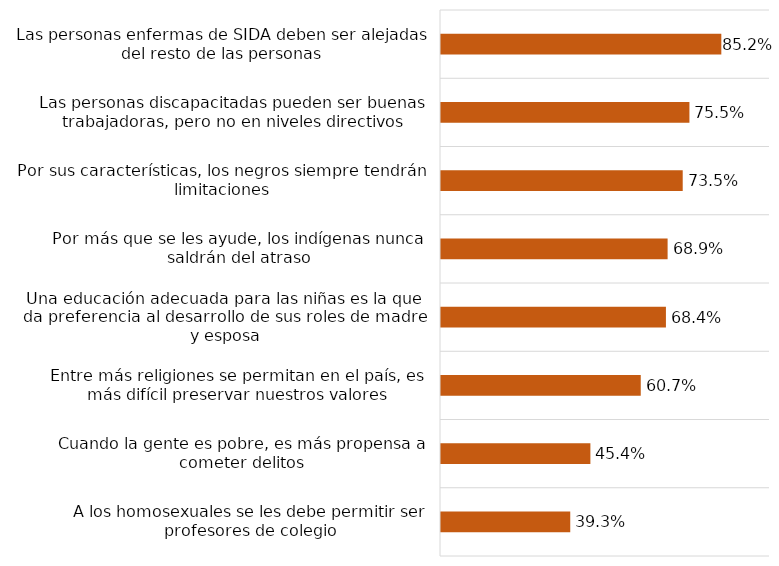
| Category | Series 0 |
|---|---|
| A los homosexuales se les debe permitir ser profesores de colegio | 0.393 |
| Cuando la gente es pobre, es más propensa a cometer delitos | 0.454 |
| Entre más religiones se permitan en el país, es más difícil preservar nuestros valores | 0.607 |
| Una educación adecuada para las niñas es la que da preferencia al desarrollo de sus roles de madre y esposa | 0.684 |
| Por más que se les ayude, los indígenas nunca saldrán del atraso | 0.689 |
| Por sus características, los negros siempre tendrán limitaciones | 0.735 |
| Las personas discapacitadas pueden ser buenas trabajadoras, pero no en niveles directivos | 0.755 |
| Las personas enfermas de SIDA deben ser alejadas del resto de las personas | 0.852 |